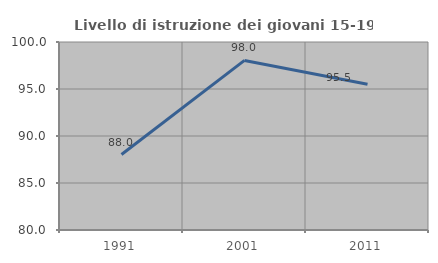
| Category | Livello di istruzione dei giovani 15-19 anni |
|---|---|
| 1991.0 | 88.028 |
| 2001.0 | 98.039 |
| 2011.0 | 95.495 |